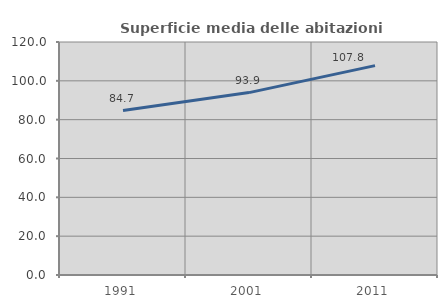
| Category | Superficie media delle abitazioni occupate |
|---|---|
| 1991.0 | 84.681 |
| 2001.0 | 93.944 |
| 2011.0 | 107.83 |